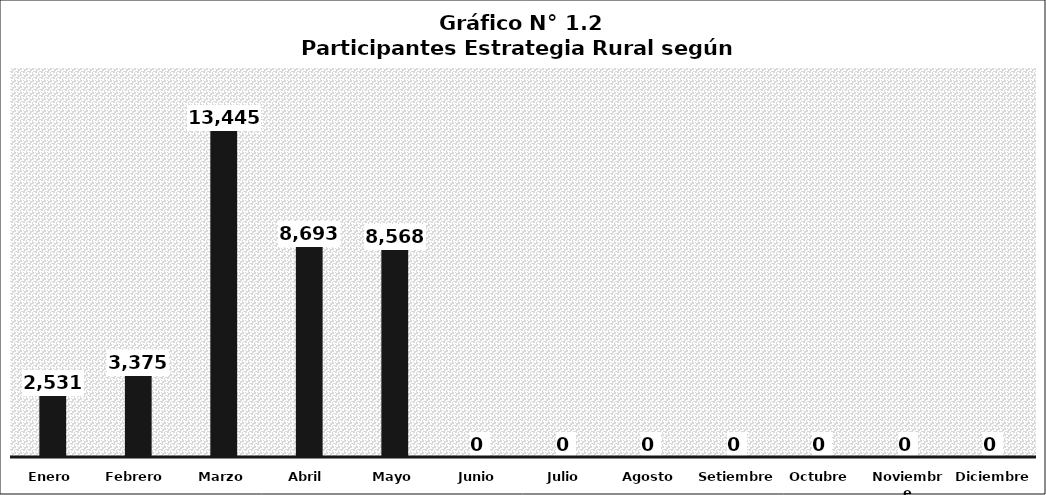
| Category | Series 0 |
|---|---|
| Enero | 2531 |
| Febrero | 3375 |
| Marzo | 13445 |
| Abril | 8693 |
| Mayo | 8568 |
| Junio | 0 |
| Julio | 0 |
| Agosto | 0 |
| Setiembre | 0 |
| Octubre | 0 |
| Noviembre | 0 |
| Diciembre | 0 |